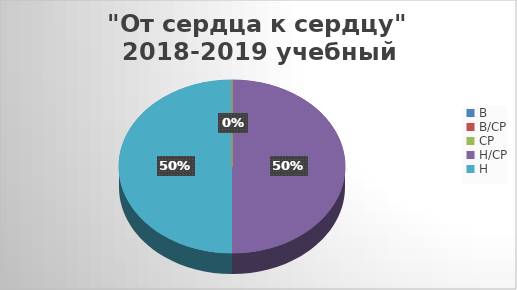
| Category | декабрь | май |
|---|---|---|
| В | 0 | 0 |
| В/СР | 0 | 0 |
| СР | 0 | 4 |
| Н/СР | 3 | 2 |
| Н | 3 | 0 |